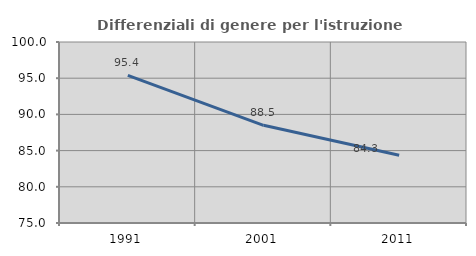
| Category | Differenziali di genere per l'istruzione superiore |
|---|---|
| 1991.0 | 95.4 |
| 2001.0 | 88.493 |
| 2011.0 | 84.35 |